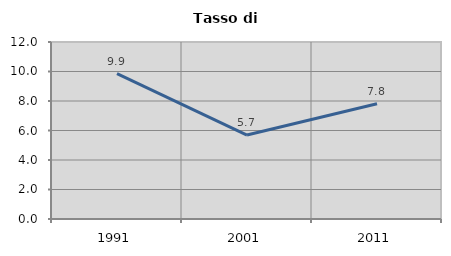
| Category | Tasso di disoccupazione   |
|---|---|
| 1991.0 | 9.856 |
| 2001.0 | 5.69 |
| 2011.0 | 7.816 |